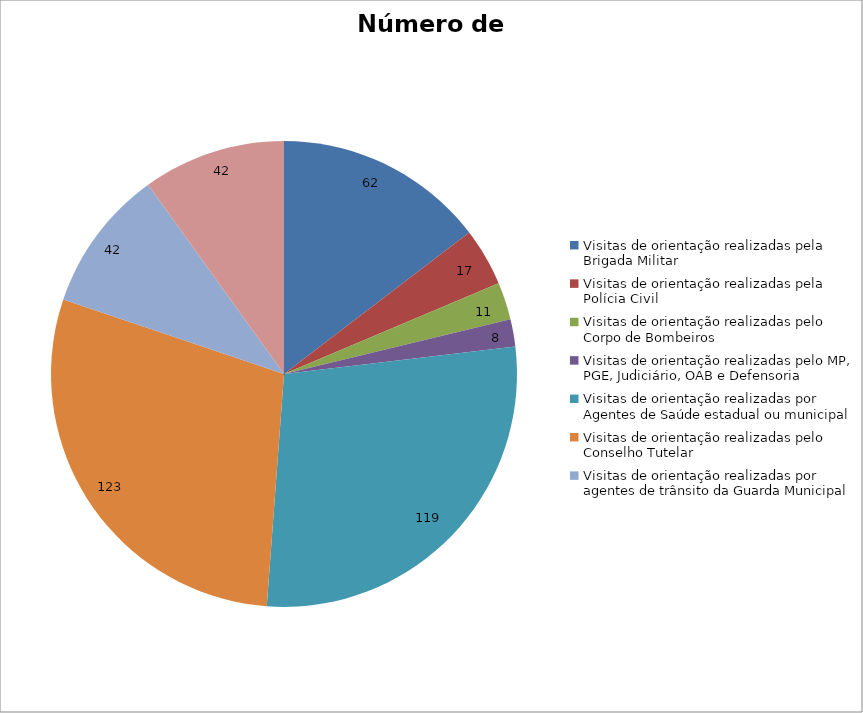
| Category | Número de Ações |
|---|---|
| Visitas de orientação realizadas pela Brigada Militar | 62 |
| Visitas de orientação realizadas pela Polícia Civil | 17 |
| Visitas de orientação realizadas pelo Corpo de Bombeiros | 11 |
| Visitas de orientação realizadas pelo MP, PGE, Judiciário, OAB e Defensoria | 8 |
| Visitas de orientação realizadas por Agentes de Saúde estadual ou municipal | 119 |
| Visitas de orientação realizadas pelo Conselho Tutelar | 123 |
| Visitas de orientação realizadas por agentes de trânsito da Guarda Municipal | 42 |
| Visitas de orientação realizadas por ONGs, entidades privadas, CRAS e CREAS | 42 |